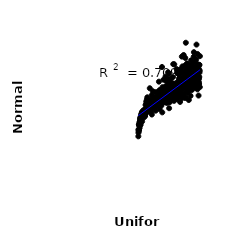
| Category | Series 0 |
|---|---|
| 151.58662230469125 | 774.494 |
| 117.02366175498116 | 627.892 |
| 141.4622938112055 | 749.544 |
| 140.04481939467075 | 779.877 |
| 138.54682849161816 | 832.307 |
| 114.3937213328714 | 646.233 |
| 111.9688835244239 | 577.009 |
| 154.23147277150008 | 740.854 |
| 108.42089313407557 | 639.082 |
| 121.60663631891065 | 674.128 |
| 137.001413410114 | 740.859 |
| 153.71407965694323 | 726.689 |
| 130.953628019818 | 778.202 |
| 137.8433108642392 | 654.74 |
| 114.67230462280449 | 609.296 |
| 139.254163358308 | 718.578 |
| 149.5701239956246 | 648.875 |
| 133.52875895147798 | 707.442 |
| 145.3219372055374 | 788.634 |
| 141.1928729245958 | 744.595 |
| 133.86503710598365 | 674.608 |
| 132.29333464374923 | 734.386 |
| 128.93570748829694 | 631.546 |
| 126.15059682240863 | 643.633 |
| 158.08882277802542 | 857.381 |
| 149.08031780903394 | 727.508 |
| 136.3329241079614 | 704.56 |
| 116.41255291665382 | 628.615 |
| 115.49649882743664 | 657.765 |
| 132.06005435090202 | 697.331 |
| 126.00508338681331 | 663.845 |
| 156.80155260295928 | 753.634 |
| 108.78196619002767 | 579.779 |
| 151.808604515911 | 891.676 |
| 123.06967446008183 | 614.426 |
| 106.119097633572 | 541.601 |
| 153.45562445195057 | 856.465 |
| 103.47065402841946 | 552.156 |
| 122.478109245833 | 654.455 |
| 140.60853881658528 | 687.217 |
| 146.70241842897883 | 999.563 |
| 123.92320524545396 | 573.206 |
| 134.06616891283485 | 718.231 |
| 148.60029297280818 | 692.555 |
| 124.88792561904154 | 665.877 |
| 116.85124174958747 | 613.667 |
| 159.60431633918424 | 862.778 |
| 132.47978972670376 | 738.433 |
| 147.92368566363774 | 750.719 |
| 107.35222295221547 | 551.413 |
| 155.34974182683015 | 834.441 |
| 122.96729861850233 | 663.537 |
| 146.87760657206462 | 749.045 |
| 151.44616522288106 | 733.985 |
| 143.60598700343752 | 676.805 |
| 127.3651615808546 | 734.247 |
| 146.13990437948104 | 825.522 |
| 122.13348809732918 | 683.137 |
| 146.3784054526746 | 814.492 |
| 141.87764462293603 | 729.429 |
| 121.03890436650336 | 669.674 |
| 140.9531317034082 | 735.844 |
| 125.52298814488245 | 667.926 |
| 101.32036258354088 | 499.237 |
| 109.46405868303056 | 665.543 |
| 150.81827046183284 | 830.56 |
| 148.25156817429348 | 812.123 |
| 124.29297364957225 | 691.127 |
| 121.47852402757475 | 709.698 |
| 109.98323734713952 | 612.051 |
| 149.7029855441926 | 741.121 |
| 105.4213727370216 | 562.684 |
| 138.2397512346903 | 714.434 |
| 101.08416524071903 | 466.673 |
| 125.84143945363542 | 700.037 |
| 135.90676135191632 | 669.985 |
| 119.35167467539978 | 631.91 |
| 135.36683302019281 | 643.774 |
| 121.93522390675261 | 633.641 |
| 128.16302346775868 | 644.787 |
| 120.30478521486637 | 654.773 |
| 148.55841964791068 | 832.536 |
| 139.4502643846024 | 700.417 |
| 124.57215566175644 | 667.228 |
| 155.64808240936648 | 849.463 |
| 118.53541247721753 | 657.965 |
| 151.02805538598574 | 747.171 |
| 115.71544281627449 | 619.642 |
| 132.82479306592532 | 677.282 |
| 129.536856654268 | 818.721 |
| 122.81125549736561 | 711.397 |
| 155.228358779723 | 740.291 |
| 117.45102276058799 | 653.709 |
| 130.78695648682475 | 754.305 |
| 132.42606245281831 | 729.745 |
| 154.66718948064377 | 757.984 |
| 122.06993177993553 | 703.245 |
| 122.67616287322589 | 658.937 |
| 119.07411628484087 | 649.112 |
| 121.13209332623866 | 644.377 |
| 115.0139581605669 | 669.954 |
| 137.30645537757508 | 749.416 |
| 100.91505817604192 | 448.77 |
| 158.91759964178874 | 755.817 |
| 147.45121055679738 | 781.876 |
| 155.90770291185535 | 772.189 |
| 138.12092981468908 | 817.153 |
| 132.11321418604717 | 653.509 |
| 133.10942454992232 | 691.69 |
| 101.88301232729307 | 491.987 |
| 157.27943849399426 | 800.377 |
| 125.75855081140696 | 636.303 |
| 126.89507557119879 | 689.779 |
| 144.94898320540008 | 855.255 |
| 155.75660786086172 | 791.736 |
| 141.65303355792307 | 819.547 |
| 105.91227618221703 | 584.841 |
| 122.35931852301326 | 686.007 |
| 130.08984277217016 | 655.153 |
| 128.75371361528977 | 673.947 |
| 148.34442213449796 | 737.296 |
| 103.22824038175337 | 550.042 |
| 139.5710368196299 | 734.275 |
| 106.19866203186267 | 556.562 |
| 134.2120527561547 | 789.173 |
| 136.60954237848986 | 675.672 |
| 140.8848481051661 | 762.114 |
| 149.44990854988134 | 839.773 |
| 103.5689535632133 | 525.405 |
| 112.2997307194285 | 612.782 |
| 102.05105420367123 | 477.639 |
| 135.13016491669896 | 711.702 |
| 121.72947291574019 | 667.912 |
| 114.1551923159175 | 637.304 |
| 117.58176020153672 | 583.617 |
| 111.1400867732507 | 607.273 |
| 127.99551988690257 | 691.306 |
| 145.1483697699441 | 751.661 |
| 159.54139163875584 | 747.216 |
| 142.59061412825744 | 696.586 |
| 141.9661062080536 | 677.868 |
| 154.03751815755416 | 882.705 |
| 115.99678716196627 | 623.583 |
| 117.06658627419644 | 603.983 |
| 136.98948004400904 | 661.585 |
| 129.86160509755555 | 736.321 |
| 159.94007260290758 | 817.4 |
| 158.36219606811042 | 773.498 |
| 119.19823053475498 | 656.526 |
| 101.69453446313864 | 497.551 |
| 131.20136207194668 | 733.077 |
| 106.77153111670388 | 586.655 |
| 119.21344259147436 | 667.16 |
| 132.62171707444702 | 675.271 |
| 107.97320202730913 | 567.929 |
| 130.54458588030832 | 810.687 |
| 132.76617391594007 | 653.032 |
| 158.75161663415227 | 850.383 |
| 149.2884276524941 | 731.298 |
| 142.67087117525335 | 782.763 |
| 128.776727026537 | 686.715 |
| 129.21576255670442 | 776.412 |
| 110.45973454655338 | 586.604 |
| 118.82158931655852 | 644.011 |
| 155.14307975481117 | 760.35 |
| 102.86289483667758 | 543.132 |
| 106.80786533695773 | 587.637 |
| 136.1520624337956 | 696.71 |
| 107.98709582020662 | 574.746 |
| 145.5447384408859 | 735.577 |
| 111.63172470300597 | 605.448 |
| 131.94282466953655 | 724.469 |
| 151.24526971229176 | 674.062 |
| 131.28352207647904 | 636.12 |
| 108.10698876845873 | 570.348 |
| 142.384537806102 | 725.945 |
| 147.0275089056367 | 802.673 |
| 111.86127096988542 | 721.067 |
| 159.6935308827816 | 790.513 |
| 124.6394364896577 | 672.364 |
| 101.22856795476362 | 457.082 |
| 154.48824002221357 | 941.723 |
| 102.6796128498152 | 527.344 |
| 151.42501608394292 | 864.962 |
| 116.47485469041813 | 662.084 |
| 143.31454226873524 | 746.066 |
| 131.5837180520668 | 721.818 |
| 151.9843090168883 | 752.023 |
| 146.9865219846219 | 783.203 |
| 124.74114544179774 | 681.542 |
| 139.8854285622441 | 665.741 |
| 104.87799833020475 | 571.975 |
| 117.68353442510812 | 696.818 |
| 136.86849508829016 | 662.382 |
| 126.1163610059692 | 720.726 |
| 102.75886771905466 | 537.299 |
| 108.88307221430803 | 589.042 |
| 104.28604480401643 | 567.602 |
| 119.69164034931637 | 675.074 |
| 146.55896577170574 | 862.497 |
| 108.57910453380097 | 571.774 |
| 112.55155848390957 | 587.584 |
| 150.66865035448015 | 817.516 |
| 144.0391511356472 | 760.985 |
| 148.97475151033112 | 702.401 |
| 120.06832395483562 | 648.697 |
| 135.52565173964638 | 867.416 |
| 105.13433688975967 | 570.827 |
| 156.68898704405944 | 897.256 |
| 107.4641051427658 | 584.898 |
| 115.88266439122606 | 634.957 |
| 105.52040745329293 | 565.057 |
| 159.27073215997785 | 837.575 |
| 144.82081853217642 | 765.606 |
| 137.40536454544448 | 742.831 |
| 145.03690880720325 | 721.386 |
| 149.41157461268003 | 780.012 |
| 130.34523707450177 | 734.544 |
| 120.58227557123203 | 648.618 |
| 153.53704914871014 | 735.517 |
| 104.10844050002189 | 539.553 |
| 157.7528754016516 | 845.991 |
| 125.33114210948762 | 652.393 |
| 156.3529066017246 | 780.476 |
| 101.60911180769003 | 493.667 |
| 147.86053559737093 | 872.79 |
| 146.00756736160918 | 692 |
| 101.04794908447339 | 467.844 |
| 102.44019355268856 | 516.821 |
| 140.36443142746202 | 675.409 |
| 111.33051793177951 | 631.024 |
| 121.36159193319575 | 593.53 |
| 113.7613741652395 | 678.663 |
| 133.9451738078719 | 748.485 |
| 106.02010013860895 | 574.97 |
| 151.72344877473142 | 860.765 |
| 112.16403177068868 | 603.823 |
| 156.03836996703842 | 740.843 |
| 145.89173439174172 | 751.364 |
| 124.18675312598836 | 727.513 |
| 146.54204203601066 | 747.278 |
| 152.53815283697418 | 755.013 |
| 148.76331314143061 | 845.44 |
| 109.04998482882917 | 652.225 |
| 116.31731616096403 | 632.931 |
| 144.32363249311416 | 736.594 |
| 125.10962526140716 | 773.116 |
| 106.64842911444917 | 556.603 |
| 159.15405430744212 | 760.28 |
| 115.0645010266322 | 661.502 |
| 128.63451063854936 | 767.455 |
| 107.02497617564624 | 549.651 |
| 156.9987948611144 | 988.175 |
| 108.62918196361302 | 615.738 |
| 112.83413286802195 | 613.869 |
| 104.47012626205924 | 517.534 |
| 157.99229981088854 | 930.803 |
| 103.44378169799246 | 542.414 |
| 143.91208676304097 | 716.353 |
| 134.3313529445006 | 700.357 |
| 117.98666725209506 | 631.881 |
| 127.47301114547506 | 768.099 |
| 144.5896295935416 | 924.513 |
| 159.39517808076454 | 778.839 |
| 123.80702717776896 | 714.059 |
| 126.42959940760788 | 722.913 |
| 152.87164305397562 | 797.989 |
| 152.29694889991072 | 708.578 |
| 138.00267017168446 | 713.062 |
| 147.71734470011177 | 812.34 |
| 128.51313228624704 | 695.603 |
| 134.54359247682183 | 868.714 |
| 154.32031144387088 | 913.936 |
| 113.28330038448901 | 629.062 |
| 137.80695574385007 | 838.375 |
| 117.84844435556225 | 664.585 |
| 150.49166413547758 | 772.339 |
| 154.73209927270094 | 800.776 |
| 104.2376494493162 | 575.545 |
| 112.40763091253643 | 606.787 |
| 137.15571214418208 | 691.156 |
| 118.33784833503339 | 666.959 |
| 119.5955484436477 | 679.121 |
| 145.82470642191197 | 730.606 |
| 140.1284742937491 | 805.703 |
| 111.23096308346372 | 602.156 |
| 137.56502878816124 | 689.497 |
| 156.1489961637179 | 850.166 |
| 153.0476929972122 | 788.646 |
| 129.81572902736866 | 749.837 |
| 113.58554847370158 | 618.559 |
| 155.50730411764897 | 729.533 |
| 133.0084179979695 | 750.031 |
| 124.42445230178612 | 677.174 |
| 130.5628502262545 | 598.592 |
| 129.27961320887624 | 732.555 |
| 116.77300861772481 | 641.086 |
| 145.66337480132063 | 661.474 |
| 157.39693064652494 | 871.347 |
| 117.38904242688703 | 654.519 |
| 142.1092193065715 | 839.613 |
| 140.28163999942444 | 803.46 |
| 156.26547448980057 | 728.291 |
| 110.30207943499673 | 618.157 |
| 111.77780769575556 | 591.699 |
| 114.0277222666988 | 595.946 |
| 126.55467154412975 | 697.039 |
| 112.92803273654502 | 625.777 |
| 121.3219741327282 | 669.551 |
| 107.68848305174687 | 594.039 |
| 124.09846688490065 | 640.585 |
| 127.57820745678903 | 648.5 |
| 151.11223722579598 | 851.169 |
| 127.25711718678212 | 710.1 |
| 160.21212414338694 | 728.089 |
| 157.5807296088554 | 743.419 |
| 153.63560264320523 | 742.616 |
| 105.24904382990684 | 551.183 |
| 139.67386949895698 | 725.84 |
| 110.53294410956296 | 612.441 |
| 136.75285838885887 | 704.463 |
| 122.2791391047895 | 662.149 |
| 107.13900301049422 | 583.002 |
| 142.87093370320554 | 661.183 |
| 150.9564026856488 | 722.885 |
| 118.18104156315579 | 664.516 |
| 109.17230062886117 | 587.468 |
| 104.64034460247964 | 550.668 |
| 126.79550516487502 | 665.184 |
| 139.36550932020913 | 732.93 |
| 160.29622896288313 | 917.451 |
| 105.78567793830594 | 579.844 |
| 134.74617732943744 | 750.519 |
| 145.37232889053607 | 673.134 |
| 105.10596108749243 | 544.928 |
| 126.33124544354123 | 683.617 |
| 102.60881562177009 | 533.754 |
| 119.46878053485322 | 665.896 |
| 149.93175665177935 | 783.719 |
| 110.83035748654902 | 594.925 |
| 107.77419841570267 | 619.169 |
| 136.4052242056436 | 719.866 |
| 123.23896351718153 | 631.341 |
| 114.24452763335383 | 613.549 |
| 131.76861393798447 | 775.591 |
| 107.55582615494724 | 569.899 |
| 129.06013732826926 | 677.051 |
| 104.96475109804864 | 558.564 |
| 103.71764463433149 | 563.24 |
| 129.38761179714595 | 707.722 |
| 135.7655967740438 | 665.396 |
| 130.20564357990847 | 692.565 |
| 143.0583238002518 | 771.771 |
| 113.65190798189187 | 623.327 |
| 147.24214385874808 | 663.21 |
| 127.68945741557755 | 632.449 |
| 110.05077182357688 | 591.912 |
| 111.47410734029 | 649.038 |
| 144.7468743446619 | 732.309 |
| 140.49461559573353 | 708.554 |
| 154.78871300727127 | 772.433 |
| 126.70243908488268 | 776.419 |
| 102.35081454672367 | 520.594 |
| 118.8589709959806 | 610.292 |
| 119.93668697865635 | 643.75 |
| 109.3959294442267 | 602.192 |
| 108.28461498144982 | 573.751 |
| 118.10521154139062 | 660.94 |
| 120.93778052240876 | 705.351 |
| 128.07025951557358 | 651.338 |
| 143.7701203972768 | 818.416 |
| 146.19441788135978 | 906.047 |
| 113.1650306007471 | 576.719 |
| 123.6115791056186 | 655.163 |
| 157.8745912145891 | 714.266 |
| 156.5484873110769 | 746.308 |
| 131.63963301159492 | 727.886 |
| 114.80220923590637 | 702.676 |
| 114.62121778162589 | 615.983 |
| 120.77454349574222 | 680.2 |
| 147.6186638774323 | 839.719 |
| 150.1463628490374 | 773.679 |
| 152.2484317897543 | 718.041 |
| 106.48612226990446 | 562.331 |
| 150.4299285502329 | 794.064 |
| 144.26431310533522 | 806.154 |
| 150.35971317143628 | 720.993 |
| 158.6974988748694 | 830.224 |
| 148.92898590063584 | 842.209 |
| 157.50831459150936 | 844.773 |
| 135.0181373441298 | 690.453 |
| 156.93667812320317 | 781.618 |
| 158.45511147702675 | 740.002 |
| 139.02859565882613 | 823.323 |
| 119.85268870466415 | 646.768 |
| 131.1009957465014 | 653.817 |
| 137.6056910511817 | 717.624 |
| 115.23888006022929 | 635.865 |
| 150.02024714200834 | 811.713 |
| 116.6158793013185 | 596.286 |
| 147.3275757038689 | 747.702 |
| 144.51295304435016 | 768.339 |
| 120.45262949445853 | 640.838 |
| 122.59311037322384 | 705.535 |
| 133.57342079348146 | 709.829 |
| 155.47526846476157 | 723.819 |
| 103.02822195574325 | 496.585 |
| 125.20649303362782 | 682.084 |
| 130.06513050254688 | 678.617 |
| 127.09159191908594 | 792.385 |
| 143.12979572914122 | 748.339 |
| 110.15400909020207 | 619.136 |
| 103.90508812927136 | 547.179 |
| 144.07777879586035 | 748.99 |
| 136.17149731797883 | 692.09 |
| 120.26732592557612 | 637 |
| 142.1964014014985 | 687.709 |
| 158.54974015874717 | 724.995 |
| 136.03761790209688 | 731.806 |
| 123.66827226267134 | 851.081 |
| 127.06626873033225 | 675.662 |
| 128.34196304893976 | 650.772 |
| 125.61807000545625 | 713.472 |
| 129.67341180010072 | 663.265 |
| 139.00331950827606 | 815.863 |
| 101.50828724259983 | 465.59 |
| 138.63351831455532 | 751.727 |
| 106.42015807313234 | 552.696 |
| 152.48520021992465 | 847.965 |
| 109.24573995488741 | 596.975 |
| 159.84102411591672 | 864.616 |
| 110.985021147687 | 589.289 |
| 107.1912950388027 | 569.434 |
| 134.45694894852227 | 698.469 |
| 133.2833173209676 | 662.487 |
| 148.05696951957177 | 711.213 |
| 102.14001328684107 | 513.431 |
| 135.28899070257353 | 679.798 |
| 117.20999380807285 | 625.459 |
| 112.12758220326295 | 596.245 |
| 160.12562660770496 | 828.762 |
| 103.99366580256924 | 566.411 |
| 123.46974115257154 | 646.103 |
| 112.7522488364373 | 627.256 |
| 113.45220437073755 | 595.264 |
| 109.61381818136765 | 579.893 |
| 133.39255852528572 | 734.505 |
| 113.86878123056306 | 559.954 |
| 118.4244474708811 | 635.887 |
| 127.90693169564949 | 676.062 |
| 118.65877319586109 | 655.631 |
| 134.85049961008332 | 723.488 |
| 109.8146217131971 | 600.447 |
| 110.93597949009887 | 590.96 |
| 154.133288250195 | 791.168 |
| 115.28641292545042 | 661.677 |
| 124.98100499773757 | 663.165 |
| 133.71968818955122 | 746.317 |
| 116.18870199958438 | 646.839 |
| 115.58974311402267 | 632.759 |
| 142.8313665131555 | 914.545 |
| 152.9873219957528 | 772.681 |
| 141.655485513751 | 691.481 |
| 140.80085821025432 | 727.042 |
| 158.9978746874084 | 676.181 |
| 153.9124165858309 | 878.477 |
| 153.21393757465518 | 818.919 |
| 130.8156326240508 | 702.795 |
| 135.63255841927827 | 727.18 |
| 134.6599320726978 | 684.813 |
| 131.497717861565 | 680.591 |
| 141.10770189731986 | 637.253 |
| 158.2017888228091 | 847.726 |
| 143.38405014880067 | 854.633 |
| 115.84104618292596 | 641.726 |
| 154.99102990417504 | 807.459 |
| 114.44773724926691 | 601.382 |
| 139.85637213356705 | 763.098 |
| 113.06065818990056 | 610.153 |
| 138.68459857839792 | 757.067 |
| 141.40485132590544 | 770.009 |
| 143.50031847637285 | 762.783 |
| 120.70661390607273 | 761.235 |
| 152.67601946282235 | 764.826 |
| 138.83872287396488 | 757.994 |
| 110.68526655767339 | 622.526 |
| 149.7921941294483 | 735.871 |
| 157.15596714708624 | 765.859 |
| 123.35033816146063 | 624.595 |
| 100.81924212561586 | 426.489 |
| 104.62970817655639 | 557.275 |
| 109.69654503252855 | 598.463 |
| 152.0805110895086 | 779.385 |
| 148.19488730427543 | 722.392 |
| 103.14635247879926 | 537.163 |
| 101.91168156142298 | 510.374 |
| 138.3579234098986 | 662.621 |
| 105.67333771855652 | 585.877 |
| 153.29515834708843 | 874.468 |
| 142.36540023738291 | 672.879 |